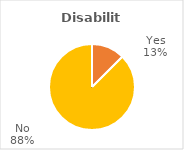
| Category | % |
|---|---|
| Yes | 11.765 |
| No | 82.353 |